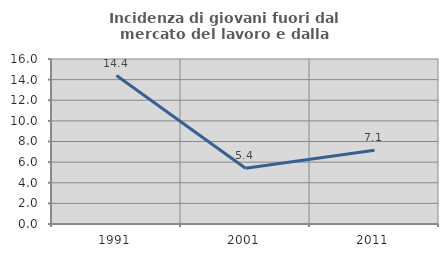
| Category | Incidenza di giovani fuori dal mercato del lavoro e dalla formazione  |
|---|---|
| 1991.0 | 14.4 |
| 2001.0 | 5.405 |
| 2011.0 | 7.143 |